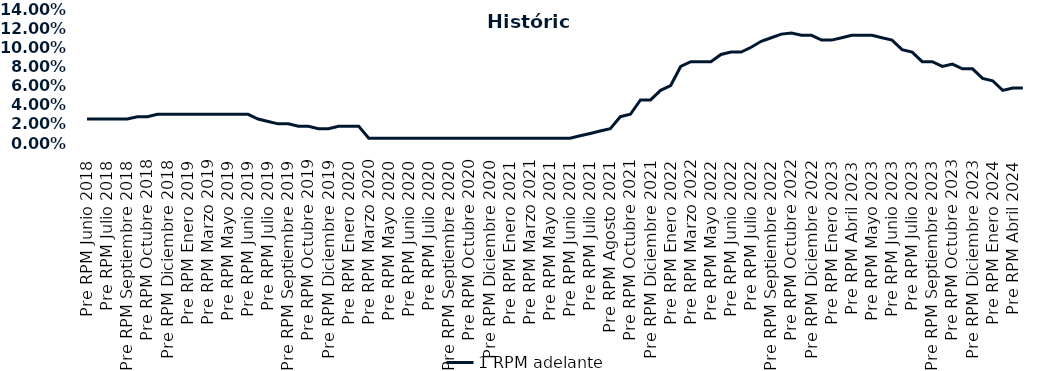
| Category | 1 RPM adelante |
|---|---|
| Pre RPM Junio 2018 | 0.025 |
| Post RPM Junio 2018 | 0.025 |
| Pre RPM Julio 2018 | 0.025 |
| Post RPM Julio 2018 | 0.025 |
| Pre RPM Septiembre 2018 | 0.025 |
| Post RPM Septiembre 2018 | 0.028 |
| Pre RPM Octubre 2018 | 0.028 |
| Post RPM Octubre 2018 | 0.03 |
| Pre RPM Diciembre 2018 | 0.03 |
| Post RPM Diciembre 2018 | 0.03 |
| Pre RPM Enero 2019 | 0.03 |
| Post RPM Enero 2019 | 0.03 |
| Pre RPM Marzo 2019 | 0.03 |
| Post RPM Marzo 2019 | 0.03 |
| Pre RPM Mayo 2019 | 0.03 |
| Post RPM Mayo 2019 | 0.03 |
| Pre RPM Junio 2019 | 0.03 |
| Post RPM Junio 2019 | 0.025 |
| Pre RPM Julio 2019 | 0.022 |
| Post RPM Julio 2019 | 0.02 |
| Pre RPM Septiembre 2019 | 0.02 |
| Post RPM Septiembre 2019 | 0.018 |
| Pre RPM Octubre 2019 | 0.018 |
| Post RPM Octubre 2019 | 0.015 |
| Pre RPM Diciembre 2019 | 0.015 |
| Post RPM Diciembre 2019 | 0.018 |
| Pre RPM Enero 2020 | 0.018 |
| Post RPM Enero 2020 | 0.018 |
| Pre RPM Marzo 2020 | 0.005 |
| Post RPM Marzo 2020 | 0.005 |
| Pre RPM Mayo 2020 | 0.005 |
| Post RPM Mayo 2020 | 0.005 |
| Pre RPM Junio 2020 | 0.005 |
| Post RPM Junio 2020 | 0.005 |
| Pre RPM Julio 2020 | 0.005 |
| Post RPM Julio 2020 | 0.005 |
| Pre RPM Septiembre 2020 | 0.005 |
| Post RPM Septiembre 2020 | 0.005 |
| Pre RPM Octubre 2020 | 0.005 |
| Post RPM Octubre 2020 | 0.005 |
| Pre RPM Diciembre 2020 | 0.005 |
| Post RPM Diciembre 2020 | 0.005 |
| Pre RPM Enero 2021 | 0.005 |
| Post RPM Enero 2021 | 0.005 |
| Pre RPM Marzo 2021 | 0.005 |
| Post RPM Marzo 2021 | 0.005 |
| Pre RPM Mayo 2021 | 0.005 |
| Post RPM Mayo 2021 | 0.005 |
| Pre RPM Junio 2021 | 0.005 |
| Post RPM Junio 2021 | 0.008 |
| Pre RPM Julio 2021 | 0.01 |
| Post RPM Julio 2021 | 0.012 |
| Pre RPM Agosto 2021 | 0.015 |
| Post RPM Agosto 2021 | 0.028 |
| Pre RPM Octubre 2021 | 0.03 |
| Post RPM Octubre 2021 | 0.045 |
| Pre RPM Diciembre 2021 | 0.045 |
| Post RPM Diciembre 2021 | 0.055 |
| Pre RPM Enero 2022 | 0.06 |
| Post RPM Enero 2022 | 0.08 |
| Pre RPM Marzo 2022 | 0.085 |
| Post RPM Marzo 2022 | 0.085 |
| Pre RPM Mayo 2022 | 0.085 |
| Post RPM Mayo 2022 | 0.092 |
| Pre RPM Junio 2022 | 0.095 |
| Post RPM Junio 2022 | 0.095 |
| Pre RPM Julio 2022 | 0.1 |
| Post RPM Julio 2022 | 0.106 |
| Pre RPM Septiembre 2022 | 0.11 |
| Post RPM Septiembre 2022 | 0.114 |
| Pre RPM Octubre 2022 | 0.115 |
| Post RPM Octubre 2022 | 0.112 |
| Pre RPM Diciembre 2022 | 0.112 |
| Post RPM Diciembre 2022 | 0.108 |
| Pre RPM Enero 2023 | 0.108 |
| Post RPM Enero 2023 | 0.11 |
| Pre RPM Abril 2023 | 0.112 |
| Post RPM Abril 2023 | 0.112 |
| Pre RPM Mayo 2023 | 0.112 |
| Post RPM Mayo 2023 | 0.11 |
| Pre RPM Junio 2023 | 0.108 |
| Post RPM Junio 2023 | 0.098 |
| Pre RPM Julio 2023 | 0.095 |
| Post RPM Julio 2023 | 0.085 |
| Pre RPM Septiembre 2023 | 0.085 |
| Post RPM Septiembre 2023 | 0.08 |
| Pre RPM Octubre 2023 | 0.082 |
| Post RPM Octubre 2023 | 0.078 |
| Pre RPM Diciembre 2023 | 0.078 |
| Post RPM Diciembre 2023 | 0.068 |
| Pre RPM Enero 2024 | 0.065 |
| Post RPM Enero 2024 | 0.055 |
| Pre RPM Abril 2024 | 0.058 |
| Post RPM Abril 2024 | 0.058 |